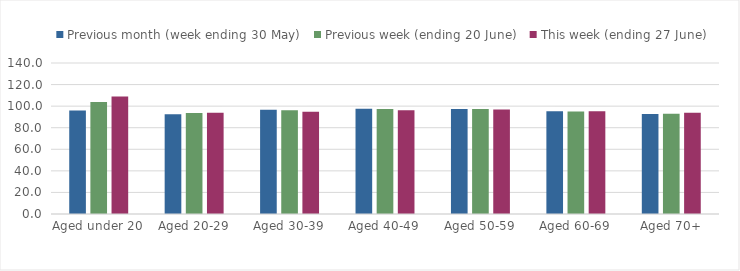
| Category | Previous month (week ending 30 May) | Previous week (ending 20 June) | This week (ending 27 June) |
|---|---|---|---|
| Aged under 20 | 95.85 | 103.844 | 108.945 |
| Aged 20-29 | 92.375 | 93.731 | 93.973 |
| Aged 30-39 | 96.587 | 96.216 | 94.791 |
| Aged 40-49 | 97.511 | 97.367 | 96.176 |
| Aged 50-59 | 97.245 | 97.4 | 96.976 |
| Aged 60-69 | 95.256 | 95.083 | 95.256 |
| Aged 70+ | 92.693 | 92.956 | 93.792 |